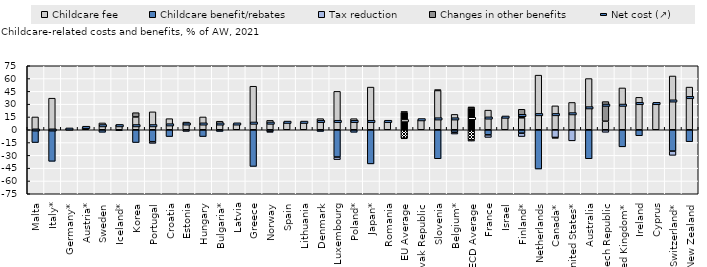
| Category | Childcare fee | Childcare benefit/rebates | Tax reduction | Changes in other benefits |
|---|---|---|---|---|
| Malta | 15 | -15 | 0 | 0 |
| Italy* | 37 | -37 | 0 | 0 |
| Germany* | 1 | 0 | 0 | 0 |
| Austria* | 3 | 0 | 0 | 0 |
| Sweden | 8 | -3 | 0 | 0 |
| Iceland* | 6 | -1 | 0 | 0 |
| Korea | 15 | -15 | 0 | 5 |
| Portugal | 21 | -14 | -2 | 0 |
| Croatia | 13 | -8 | 0 | 0 |
| Estonia | 9 | 0 | -2 | 0 |
| Hungary | 15 | -8 | 0 | 0 |
| Bulgaria* | 10 | -2 | 0 | 0 |
| Latvia | 7 | 0 | 0 | 0 |
| Greece | 51 | -43 | 0 | 0 |
| Norway | 11 | -2 | -1 | 0 |
| Spain | 9 | 0 | 0 | 0 |
| Lithuania | 9 | 0 | 0 | 0 |
| Denmark | 13 | -2 | 0 | 0 |
| Luxembourg | 45 | -32 | -3 | 0 |
| Poland* | 13 | -3 | 0 | 0 |
| Japan* | 50 | -40 | 0 | 0 |
| Romania | 10 | 0 | 0 | 0 |
| EU Average | 20.185 | -9.889 | -0.704 | 1.259 |
| Slovak Republic | 12 | 0 | 0 | 0 |
| Slovenia | 46 | -34 | 0 | 1 |
| Belgium* | 18 | -3 | -2 | 0 |
| OECD Average | 25.606 | -11.909 | -1.424 | 1.152 |
| France | 23 | -6 | -3 | 0 |
| Israel | 15 | 0 | 0 | 0 |
| Finland* | 14 | -4 | -4 | 10 |
| Netherlands | 64 | -46 | 0 | 0 |
| Canada* | 28 | 0 | -9 | -1 |
| United States* | 32 | 0 | -13 | 0 |
| Australia | 60 | -34 | 0 | 0 |
| Czech Republic | 10 | 0 | -3 | 23 |
| United Kingdom* | 49 | -20 | 0 | 0 |
| Ireland | 38 | -7 | 0 | 0 |
| Cyprus | 31 | 0 | 0 | 0 |
| Switzerland* | 63 | -25 | -5 | 0 |
| New Zealand | 50 | -14 | 0 | 0 |